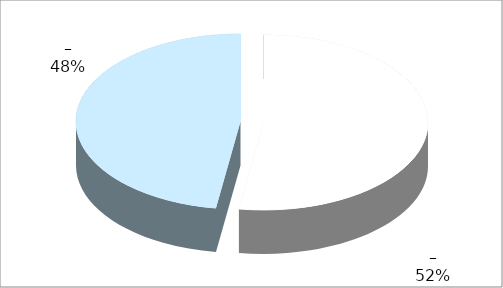
| Category | Series 0 |
|---|---|
| 0 | 11 |
| 1 | 10 |